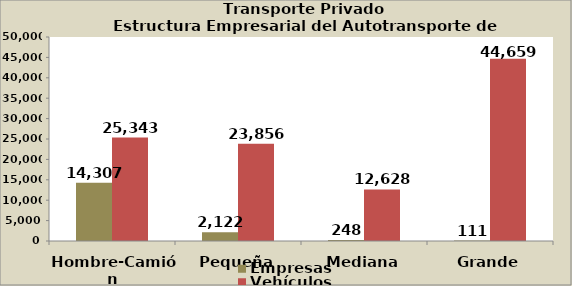
| Category | Empresas | Vehículos |
|---|---|---|
| Hombre-Camión | 14307 | 25343 |
| Pequeña | 2122 | 23856 |
| Mediana | 248 | 12628 |
| Grande | 111 | 44659 |